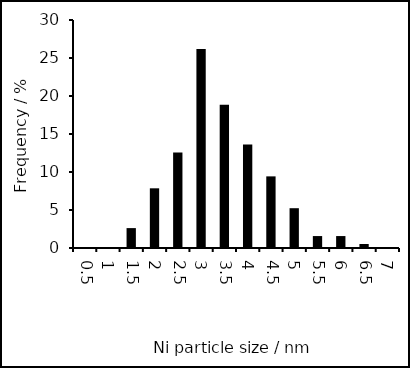
| Category | Series 0 |
|---|---|
| 0.5 | 0 |
| 1.0 | 0 |
| 1.5 | 2.618 |
| 2.0 | 7.853 |
| 2.5 | 12.565 |
| 3.0 | 26.178 |
| 3.5 | 18.848 |
| 4.0 | 13.613 |
| 4.5 | 9.424 |
| 5.0 | 5.236 |
| 5.5 | 1.571 |
| 6.0 | 1.571 |
| 6.5 | 0.524 |
| 7.0 | 0 |